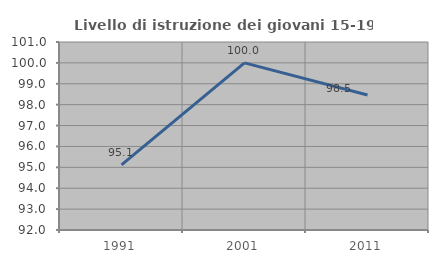
| Category | Livello di istruzione dei giovani 15-19 anni |
|---|---|
| 1991.0 | 95.122 |
| 2001.0 | 100 |
| 2011.0 | 98.462 |